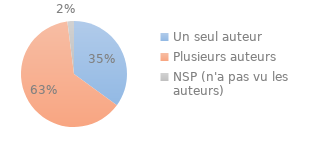
| Category | Series 0 |
|---|---|
| Un seul auteur | 0.35 |
| Plusieurs auteurs | 0.63 |
| NSP (n'a pas vu les auteurs) | 0.02 |